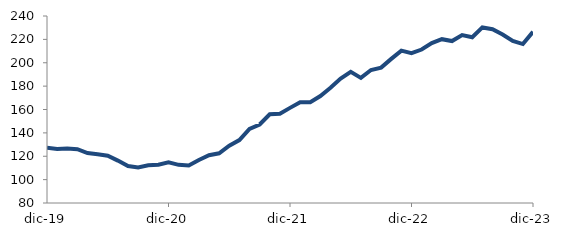
| Category | Series 0 |
|---|---|
| 2019-12-01 | 127.192 |
| 2020-01-01 | 126.144 |
| 2020-02-01 | 126.638 |
| 2020-03-01 | 125.992 |
| 2020-04-01 | 122.726 |
| 2020-05-01 | 121.669 |
| 2020-06-01 | 120.485 |
| 2020-07-01 | 116.268 |
| 2020-08-01 | 111.597 |
| 2020-09-01 | 110.39 |
| 2020-10-01 | 112.229 |
| 2020-11-01 | 112.769 |
| 2020-12-01 | 114.741 |
| 2021-01-01 | 112.625 |
| 2021-02-01 | 112.14 |
| 2021-03-01 | 116.74 |
| 2021-04-01 | 120.911 |
| 2021-05-01 | 122.536 |
| 2021-06-01 | 128.968 |
| 2021-07-01 | 133.864 |
| 2021-08-01 | 143.384 |
| 2021-09-01 | 147.196 |
| 2021-10-01 | 155.883 |
| 2021-11-01 | 156.426 |
| 2021-12-01 | 161.4 |
| 2022-01-01 | 166.276 |
| 2022-02-01 | 166.219 |
| 2022-03-01 | 171.531 |
| 2022-04-01 | 178.644 |
| 2022-05-01 | 186.465 |
| 2022-06-01 | 192.187 |
| 2022-07-01 | 187.044 |
| 2022-08-01 | 193.806 |
| 2022-09-01 | 195.846 |
| 2022-10-01 | 203.287 |
| 2022-11-01 | 210.344 |
| 2022-12-01 | 208.16 |
| 2023-01-01 | 211.29 |
| 2023-02-01 | 216.772 |
| 2023-03-01 | 220.156 |
| 2023-04-01 | 218.537 |
| 2023-05-01 | 223.702 |
| 2023-06-01 | 221.798 |
| 2023-07-01 | 230.236 |
| 2023-08-01 | 228.637 |
| 2023-09-01 | 224.175 |
| 2023-10-01 | 218.647 |
| 2023-11-01 | 215.985 |
| 2023-12-01 | 226.505 |